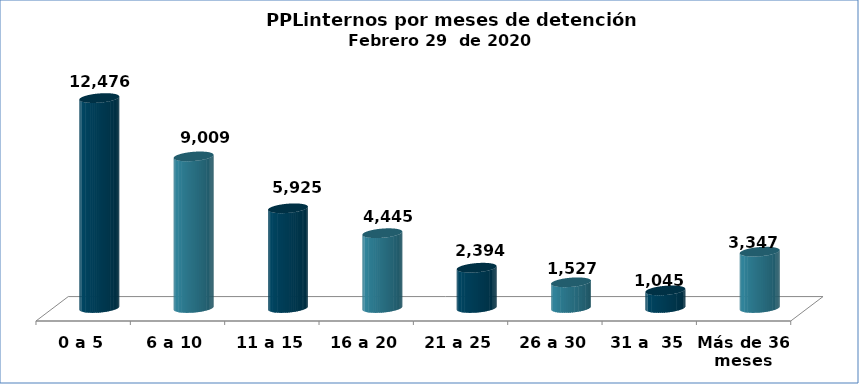
| Category | Series 0 |
|---|---|
| 0 a 5 | 12476 |
| 6 a 10 | 9009 |
| 11 a 15 | 5925 |
| 16 a 20 | 4445 |
| 21 a 25 | 2394 |
| 26 a 30 | 1527 |
| 31 a  35 | 1045 |
| Más de 36 meses | 3347 |